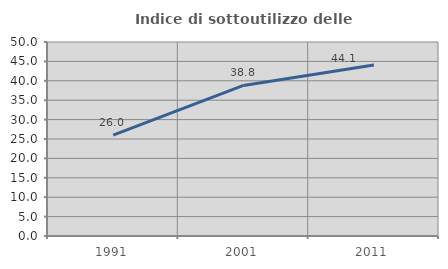
| Category | Indice di sottoutilizzo delle abitazioni  |
|---|---|
| 1991.0 | 25.974 |
| 2001.0 | 38.808 |
| 2011.0 | 44.055 |